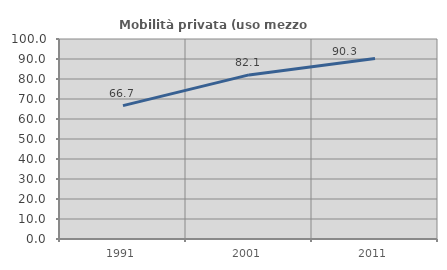
| Category | Mobilità privata (uso mezzo privato) |
|---|---|
| 1991.0 | 66.667 |
| 2001.0 | 82.051 |
| 2011.0 | 90.291 |